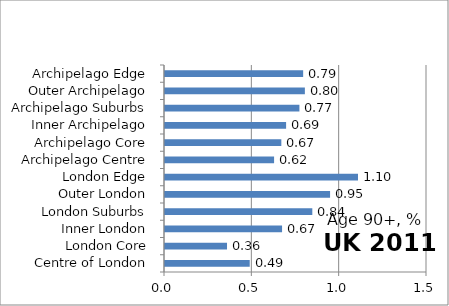
| Category | Series 0 |
|---|---|
| Centre of London | 0.485 |
| London Core | 0.355 |
| Inner London | 0.67 |
| London Suburbs | 0.843 |
| Outer London | 0.945 |
| London Edge | 1.105 |
| Archipelago Centre | 0.625 |
| Archipelago Core | 0.666 |
| Inner Archipelago | 0.693 |
| Archipelago Suburbs | 0.77 |
| Outer Archipelago | 0.801 |
| Archipelago Edge | 0.791 |